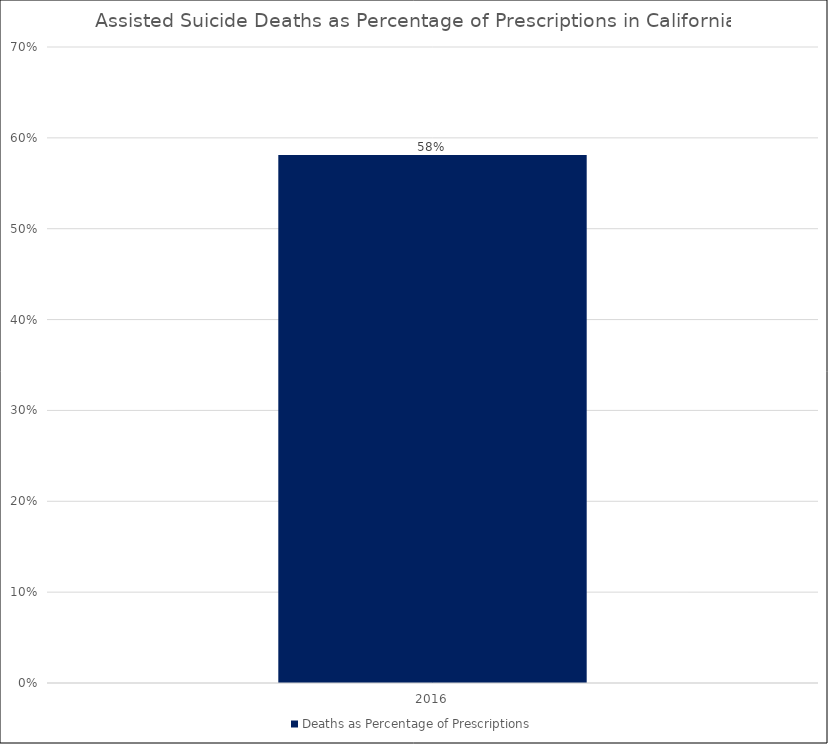
| Category | Deaths as Percentage of Prescriptions |
|---|---|
| 2016.0 | 0.581 |